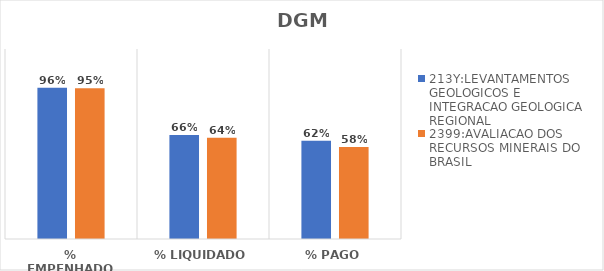
| Category | 213Y:LEVANTAMENTOS GEOLOGICOS E INTEGRACAO GEOLOGICA REGIONAL | 2399:AVALIACAO DOS RECURSOS MINERAIS DO BRASIL |
|---|---|---|
| % EMPENHADO | 0.956 | 0.953 |
| % LIQUIDADO | 0.658 | 0.639 |
| % PAGO | 0.621 | 0.58 |